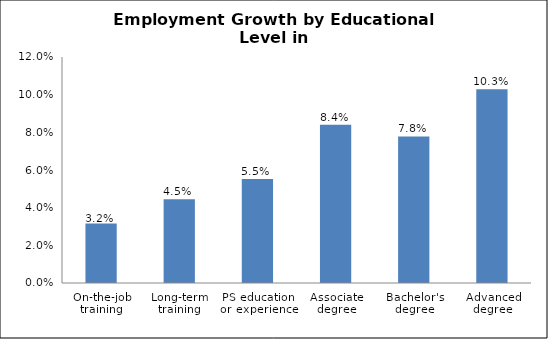
| Category | Series 0 |
|---|---|
| On-the-job training | 0.032 |
| Long-term training | 0.045 |
| PS education or experience | 0.055 |
| Associate degree | 0.084 |
| Bachelor's degree | 0.078 |
| Advanced degree | 0.103 |